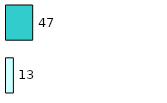
| Category | Series 0 | Series 1 |
|---|---|---|
| 0 | 13 | 47 |